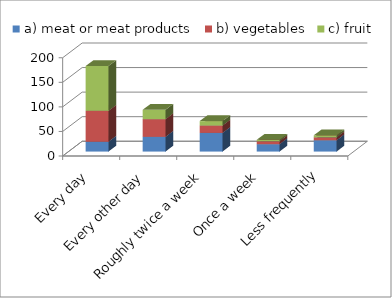
| Category | a) meat or meat products | b) vegetables | c) fruit |
|---|---|---|---|
| Every day | 20 | 63 | 91 |
| Every other day | 30 | 36 | 19 |
| Roughly twice a week | 38 | 15 | 9 |
| Once a week | 15 | 6 | 3 |
| Less frequently | 23 | 6 | 4 |